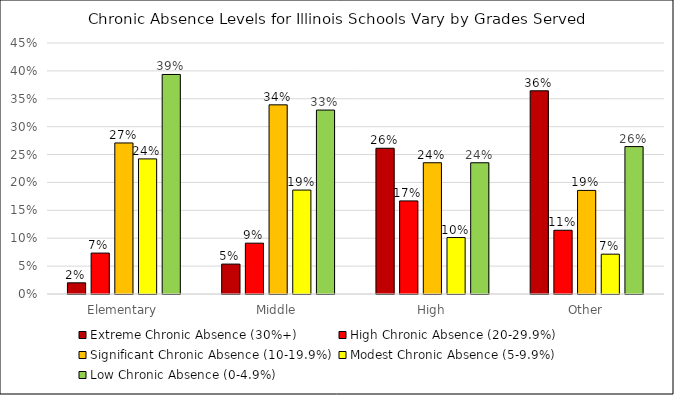
| Category | Extreme Chronic Absence (30%+) | High Chronic Absence (20-29.9%) | Significant Chronic Absence (10-19.9%) | Modest Chronic Absence (5-9.9%) | Low Chronic Absence (0-4.9%) |
|---|---|---|---|---|---|
| Elementary | 0.02 | 0.073 | 0.271 | 0.242 | 0.394 |
| Middle | 0.054 | 0.091 | 0.339 | 0.186 | 0.33 |
| High | 0.261 | 0.167 | 0.235 | 0.101 | 0.235 |
| Other | 0.364 | 0.114 | 0.186 | 0.071 | 0.264 |